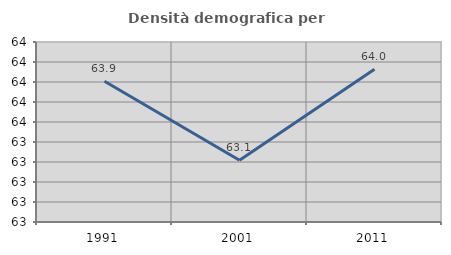
| Category | Densità demografica |
|---|---|
| 1991.0 | 63.907 |
| 2001.0 | 63.118 |
| 2011.0 | 64.028 |